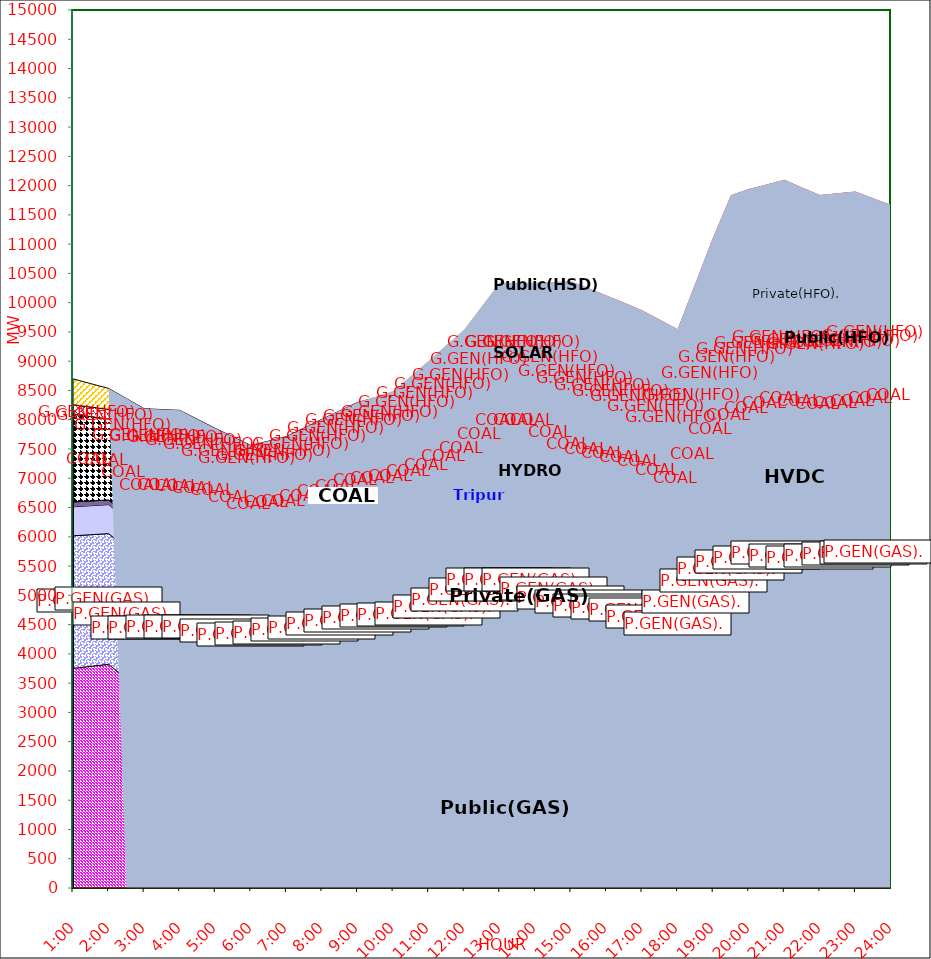
| Category | GAS | P.GEN(GAS). |  HVDC | TRIPURA | HYDRO | COAL | SOLAR | G.GEN(HFO) | P.GEN(HFO). | G.GEN(HSD) | P.GEN(HSD) | SHORTAGE | Total Energy Gen 233.511 MKWHr 
Energy Not Served   0.880 MKWHr 
Energy Requirement     234.392 MKWHr  |
|---|---|---|---|---|---|---|---|---|---|---|---|---|---|
| 1:00 | 3752 | 2265 | 495 | 84 | 0 | 1497 | 0 | 163 | 442 | 0 | 0 | 0 |  |
| 1:30 | 3787 | 2248.5 | 495.5 | 82 | 0 | 1440 | 0 | 163 | 400.5 | 0 | 0 | 0 |  |
| 2:00 | 3822 | 2232 | 496 | 80 | 0 | 1383 | 0 | 163 | 359 | 0 | 0 | 0 |  |
| 2:30 | 3573.5 | 2233 | 495.5 | 82 | 0 | 1455.5 | 0 | 163 | 359 | 0 | 0 | 0 |  |
| 3:00 | 3325 | 2234 | 495 | 84 | 0 | 1528 | 0 | 163 | 359 | 0 | 0 | 0 |  |
| 3:30 | 3367 | 2175 | 495.5 | 82 | 0 | 1532 | 0 | 163 | 359.5 | 0 | 0 | 0 |  |
| 4:00 | 3409 | 2116 | 496 | 80 | 0 | 1536 | 0 | 163 | 360 | 0 | 0 | 0 |  |
| 4:30 | 3395 | 2138.5 | 496 | 77 | 0 | 1472.5 | 0 | 163 | 264 | 0 | 0 | 0 |  |
| 5:00 | 3381 | 2161 | 496 | 74 | 0 | 1409 | 0 | 163 | 168 | 0 | 0 | 0 |  |
| 5:30 | 3364.5 | 2068.5 | 495.5 | 73 | 0 | 1383 | 8.5 | 163 | 150.5 | 0 | 0 | 0 |  |
| 6:00 | 3348 | 1976 | 495 | 72 | 0 | 1357 | 17 | 163 | 133 | 0 | 0 | 0 |  |
| 6:30 | 3349.5 | 2005 | 495 | 72 | 0 | 1352.5 | 51 | 163 | 148 | 0 | 0 | 0 |  |
| 7:00 | 3351 | 2034 | 495 | 72 | 0 | 1348 | 85 | 163 | 163 | 0 | 0 | 0 |  |
| 7:30 | 3354 | 2113 | 495 | 73 | 0 | 1352 | 130.5 | 163 | 179 | 0 | 0 | 0 |  |
| 8:00 | 3357 | 2192 | 495 | 74 | 0 | 1356 | 176 | 163 | 195 | 0 | 0 | 0 |  |
| 8:30 | 3396.5 | 2238 | 495.5 | 77 | 0 | 1354 | 216.5 | 179 | 195 | 0 | 0 | 0 |  |
| 9:00 | 3436 | 2284 | 496 | 80 | 0 | 1352 | 257 | 195 | 195 | 0 | 0 | 0 |  |
| 9:30 | 3484 | 2269 | 496 | 76 | 0 | 1364.5 | 280 | 203 | 204 | 14 | 0 | 0 |  |
| 10:00 | 3532 | 2254 | 496 | 72 | 0 | 1377 | 303 | 211 | 213 | 28 | 0 | 0 |  |
| 10:30 | 3536 | 2284 | 496 | 78 | 12.5 | 1468 | 327.5 | 203 | 274 | 65 | 0 | 0 |  |
| 11:00 | 3540 | 2314 | 496 | 84 | 25 | 1559 | 352 | 195 | 335 | 102 | 0 | 0 |  |
| 11:30 | 3666.5 | 2286.5 | 496.5 | 86 | 25 | 1641 | 331.5 | 179 | 431.5 | 127 | 0 | 0 |  |
| 12:00 | 3793 | 2259 | 497 | 88 | 25 | 1723 | 311 | 163 | 528 | 152 | 0 | 0 |  |
| 12:30 | 3945 | 2299 | 496.5 | 94 | 25 | 1800 | 312.5 | 163 | 653 | 152 | 0 | 0 |  |
| 13:00 | 4097 | 2339 | 496 | 100 | 25 | 1877 | 314 | 163 | 778 | 152 | 0 | 0 |  |
| 13:30 | 4097 | 2339 | 496 | 100 | 25 | 1877 | 314 | 163 | 778 | 152 | 0 | 0 |  |
| 14:00 | 4097 | 2339 | 496 | 100 | 25 | 1877 | 314 | 163 | 778 | 152 | 0 | 0 |  |
| 14:30 | 4006.5 | 2212.5 | 495.5 | 101 | 25 | 1908.5 | 255.5 | 163 | 1008 | 178.5 | 0 | 0 |  |
| 15:00 | 3916 | 2086 | 495 | 102 | 25 | 1940 | 197 | 163 | 1238 | 205 | 0 | 0 |  |
| 15:30 | 3862.5 | 2060 | 494.5 | 103 | 25 | 1937 | 156 | 163 | 1163.5 | 258.5 | 0 | 22.442 |  |
| 16:00 | 3809 | 2034 | 494 | 104 | 25 | 1934 | 115 | 163 | 1089 | 312 | 0 | 44.885 |  |
| 16:30 | 3798 | 1983.5 | 493.5 | 101 | 25 | 1935 | 85 | 163 | 1101 | 261 | 0 | 51.093 |  |
| 17:00 | 3787 | 1933 | 493 | 98 | 25 | 1936 | 55 | 163 | 1113 | 210 | 0 | 57.3 |  |
| 17:30 | 3703.5 | 1871.5 | 492.5 | 98 | 25 | 1929.5 | 34 | 163 | 1205 | 125 | 0 | 62.075 |  |
| 18:00 | 3620 | 1810 | 492 | 98 | 25 | 1923 | 13 | 163 | 1297 | 40 | 0 | 66.85 |  |
| 18:30 | 3872.5 | 2035 | 492 | 119 | 25 | 1768.5 | 6.5 | 226 | 1631.5 | 50 | 0 | 106.482 |  |
| 19:00 | 4125 | 2260 | 492 | 140 | 25 | 1614 | 0 | 289 | 1966 | 60 | 0 | 146.115 |  |
| 19:30 | 4343 | 2232 | 493 | 142 | 25 | 1701 | 0 | 292 | 2462 | 0 | 0 | 144.683 |  |
| 20:00 | 4450 | 2245 | 493 | 140 | 25 | 1706 | 0 | 326 | 2412 | 0 | 0 | 143.25 |  |
| 20:30 | 4530.5 | 2244.5 | 493 | 142 | 25 | 1708 | 0 | 360 | 2398.5 | 0 | 0 | 118.125 |  |
| 21:00 | 4611 | 2244 | 493 | 144 | 25 | 1710 | 0 | 394 | 2385 | 0 | 0 | 93 |  |
| 21:30 | 4570 | 2235.5 | 493 | 146 | 25 | 1710.5 | 0 | 370.5 | 2347 | 0 | 0 | 71.5 |  |
| 22:00 | 4529 | 2227 | 493 | 148 | 25 | 1711 | 0 | 347 | 2309 | 0 | 0 | 50 |  |
| 22:30 | 4559.5 | 2236 | 493 | 147 | 12.5 | 1709 | 0 | 347 | 2294 | 0 | 0 | 71 |  |
| 23:00 | 4590 | 2245 | 493 | 146 | 0 | 1707 | 0 | 347 | 2279 | 0 | 0 | 92 |  |
| 23:30 | 4595 | 2263.5 | 493 | 147 | 0 | 1754.5 | 0 | 356.5 | 1980.5 | 0 | 0 | 195 |  |
| 24:00 | 4600 | 2282 | 493 | 148 | 0 | 1802 | 0 | 366 | 1682 | 0 | 0 | 298 |  |